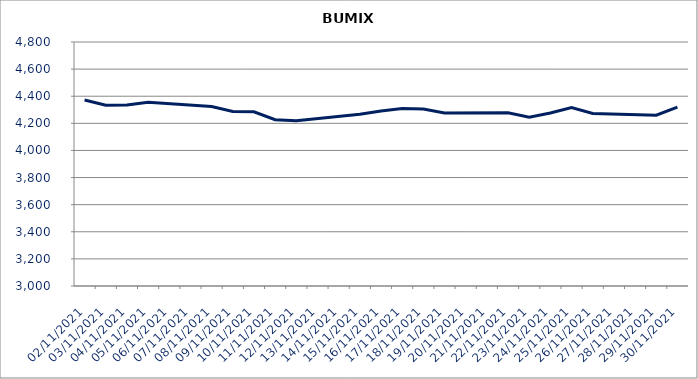
| Category | BUMIX |
|---|---|
| 02/11/2021 | 4371.95 |
| 03/11/2021 | 4334.22 |
| 04/11/2021 | 4335.89 |
| 05/11/2021 | 4356.33 |
| 08/11/2021 | 4323.72 |
| 09/11/2021 | 4286.95 |
| 10/11/2021 | 4285.37 |
| 11/11/2021 | 4226.99 |
| 12/11/2021 | 4219.97 |
| 15/11/2021 | 4267.57 |
| 16/11/2021 | 4290.72 |
| 17/11/2021 | 4308.88 |
| 18/11/2021 | 4305.32 |
| 19/11/2021 | 4275.83 |
| 22/11/2021 | 4277.83 |
| 23/11/2021 | 4245.77 |
| 24/11/2021 | 4275.81 |
| 25/11/2021 | 4316.18 |
| 26/11/2021 | 4273.42 |
| 29/11/2021 | 4260.04 |
| 30/11/2021 | 4320.18 |